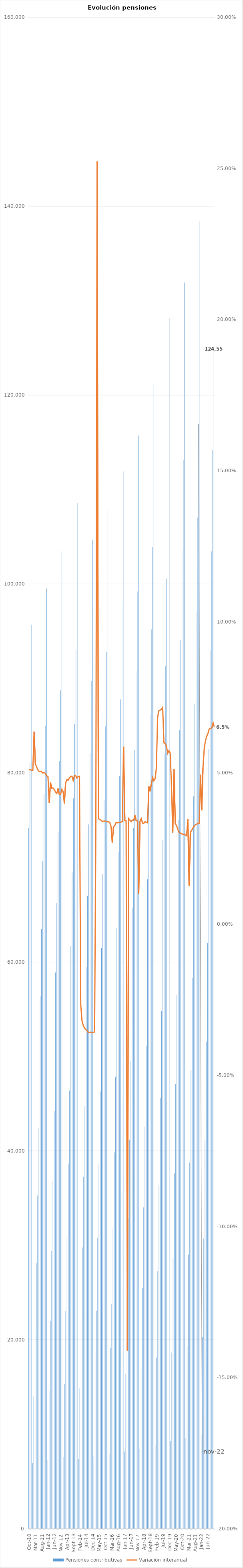
| Category | Pensiones contributivas |
|---|---|
| 2010-10-01 | 74161.4 |
| 2010-11-01 | 81044.11 |
| 2010-12-01 | 95701.8 |
| 2011-01-01 | 6942.58 |
| 2011-02-01 | 14012.25 |
| 2011-03-01 | 21068.62 |
| 2011-04-01 | 28149.38 |
| 2011-05-01 | 35270.6 |
| 2011-06-01 | 42399.06 |
| 2011-07-01 | 56350.54 |
| 2011-08-01 | 63501.1 |
| 2011-09-01 | 70654.72 |
| 2011-10-01 | 77799.08 |
| 2011-11-01 | 85005.14 |
| 2011-12-01 | 99533.71 |
| 2012-01-01 | 7268.03 |
| 2012-02-01 | 14642.48 |
| 2012-03-01 | 22017.83 |
| 2012-04-01 | 29404.37 |
| 2012-05-01 | 36811.75 |
| 2012-06-01 | 44231.2 |
| 2012-07-01 | 58880.63 |
| 2012-08-01 | 66225.5 |
| 2012-09-01 | 73696.1 |
| 2012-10-01 | 81269 |
| 2012-11-01 | 88738.29 |
| 2012-12-01 | 103503.79 |
| 2013-01-01 | 7607.25 |
| 2013-02-01 | 15342.79 |
| 2013-03-01 | 23065.32 |
| 2013-04-01 | 30826.76 |
| 2013-05-01 | 38610.98 |
| 2013-06-01 | 46395.72 |
| 2013-07-01 | 61678.16 |
| 2013-08-01 | 69483.87 |
| 2013-09-01 | 77313.52 |
| 2013-10-01 | 85194.59 |
| 2013-11-01 | 93072.56 |
| 2013-12-01 | 108564.305 |
| 2014-01-01 | 7404.63 |
| 2014-02-01 | 14852.34 |
| 2014-03-01 | 22294.45 |
| 2014-04-01 | 29767.06 |
| 2014-05-01 | 37264.08 |
| 2014-06-01 | 44764.3 |
| 2014-07-01 | 59465.73 |
| 2014-08-01 | 66998.75 |
| 2014-09-01 | 74551.55 |
| 2014-10-01 | 82142.36 |
| 2014-11-01 | 89746.16 |
| 2014-12-01 | 104688.362 |
| 2015-01-01 | 7655.23 |
| 2015-02-01 | 18599.03 |
| 2015-03-01 | 23072.71 |
| 2015-04-01 | 30798.46 |
| 2015-05-01 | 38547.07 |
| 2015-06-01 | 46285.81 |
| 2015-07-01 | 61490.33 |
| 2015-08-01 | 69284.2 |
| 2015-09-01 | 77086.14 |
| 2015-10-01 | 84925.81 |
| 2015-11-01 | 92783.39 |
| 2015-12-01 | 108213.946 |
| 2016-01-01 | 7903.52 |
| 2016-02-01 | 19100.9 |
| 2016-03-01 | 23816.34 |
| 2016-04-01 | 31803.24 |
| 2016-05-01 | 39841.83 |
| 2016-06-01 | 47836.77 |
| 2016-07-01 | 63561.03 |
| 2016-08-01 | 71611.19 |
| 2016-09-01 | 79692.5 |
| 2016-10-01 | 87805.42 |
| 2016-11-01 | 98231.23 |
| 2016-12-01 | 111915.859 |
| 2017-01-01 | 8173.612 |
| 2017-02-01 | 16406.774 |
| 2017-03-01 | 24648.317 |
| 2017-04-01 | 32897.599 |
| 2017-05-01 | 41191.139 |
| 2017-06-01 | 49483.606 |
| 2017-07-01 | 65744.166 |
| 2017-08-01 | 74188.55 |
| 2017-09-01 | 82419.721 |
| 2017-10-01 | 90805.839 |
| 2017-11-01 | 99211.351 |
| 2017-12-01 | 115722.364 |
| 2018-01-01 | 8459.271 |
| 2018-02-01 | 16954.769 |
| 2018-03-01 | 25470.156 |
| 2018-04-01 | 34013.461 |
| 2018-05-01 | 42578.301 |
| 2018-06-01 | 51142.623 |
| 2018-07-01 | 68742.415 |
| 2018-08-01 | 77449.071 |
| 2018-09-01 | 86234.754 |
| 2018-10-01 | 95207.686 |
| 2018-11-01 | 103914.284 |
| 2018-12-01 | 121290.03 |
| 2019-01-01 | 8895.995 |
| 2019-02-01 | 18116.1 |
| 2019-03-01 | 27267.718 |
| 2019-04-01 | 36420.953 |
| 2019-05-01 | 45604.679 |
| 2019-06-01 | 54809.147 |
| 2019-07-01 | 72866.362 |
| 2019-08-01 | 82074.206 |
| 2019-09-01 | 91311.772 |
| 2019-10-01 | 100589.589 |
| 2019-11-01 | 109878.405 |
| 2019-12-01 | 128148.559 |
| 2020-01-01 | 9301.888 |
| 2020-02-01 | 18664.365 |
| 2020-03-01 | 28667.644 |
| 2020-04-01 | 37629.309 |
| 2020-05-01 | 47092.242 |
| 2020-06-01 | 56529.164 |
| 2020-07-01 | 75078.021 |
| 2020-08-01 | 84545.384 |
| 2020-09-01 | 94040.361 |
| 2020-10-01 | 103575.363 |
| 2020-11-01 | 113152.729 |
| 2020-12-01 | 131922.494 |
| 2021-01-01 | 9573.791 |
| 2021-02-01 | 19311.474 |
| 2021-03-01 | 29030.111 |
| 2021-04-01 | 38774.791 |
| 2021-05-01 | 48551.803 |
| 2021-06-01 | 58326.491 |
| 2021-07-01 | 77520.899 |
| 2021-08-01 | 87326.247 |
| 2021-09-01 | 97151.878 |
| 2021-10-01 | 107025.823 |
| 2021-11-01 | 116928.599 |
| 2021-12-01 | 138443.355 |
| 2022-01-01 | 9934.798 |
| 2022-02-01 | 20312.51 |
| 2022-03-01 | 30719.525 |
| 2022-04-01 | 41130.665 |
| 2022-05-01 | 51570.083 |
| 2022-06-01 | 62011.11 |
| 2022-07-01 | 82529.28 |
| 2022-08-01 | 92979.37 |
| 2022-09-01 | 103466.46 |
| 2022-10-01 | 114155.9 |